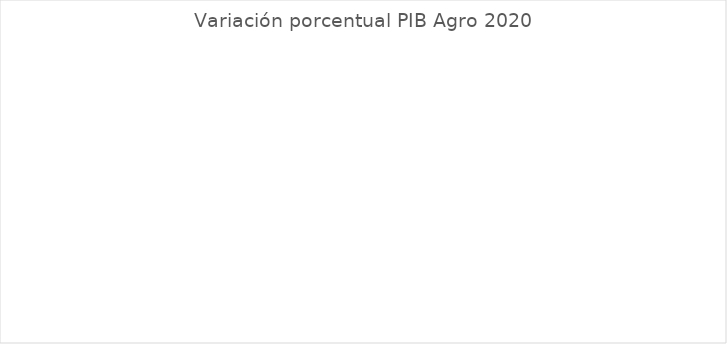
| Category | Varaición porcentual PIB Agro |
|---|---|
| San Andrés, Providencia y Santa Catalina (Archipiélago) | 18.037 |
| Amazonas | 9.847 |
| Bolívar | 4.802 |
| Guainía | 4.546 |
| Sucre | 4.158 |
| Valle del Cauca | 3.792 |
| Nariño | 3.552 |
| Córdoba | 2.977 |
| Huila | 2.943 |
| Chocó | 2.726 |
| Risaralda | 2.655 |
| Meta | 2.636 |
| Caquetá | 2.61 |
| Boyacá | 2.59 |
| COLOMBIA | 2.559 |
| Tolima | 2.519 |
| Antioquia | 2.428 |
| Putumayo | 2.415 |
| Norte de Santander | 2.391 |
| Cundinamarca | 2.375 |
| Casanare | 2.292 |
| Arauca | 2.251 |
| La Guajira | 2.073 |
| Santander | 1.965 |
| Vichada | 1.921 |
| Guaviare | 1.881 |
| Magdalena | 1.797 |
| Caldas | 1.634 |
| Bogotá D.C. | 1.626 |
| Cauca | 1.416 |
| Cesar | 1.361 |
| Vaupés | 1.344 |
| Atlántico | 1.289 |
| Quindío | 1.069 |